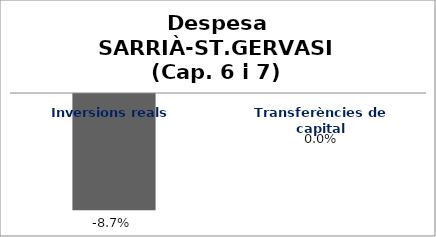
| Category | Series 0 |
|---|---|
| Inversions reals | -0.087 |
| Transferències de capital | 0 |